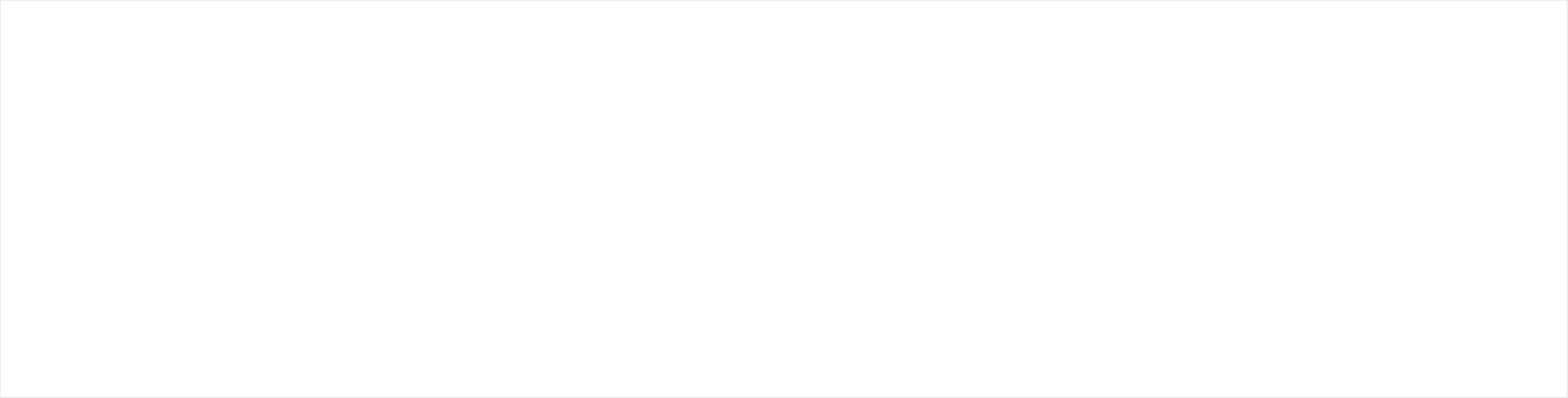
| Category | Gemiddelde van Actueel | Gemiddelde van Gewenst |
|---|---|---|
| 01 Governance | 2.667 | 3 |
| 02 Organisatie | 3 | 4 |
| 03 Risk Management | 2.667 | 5 |
| 04 Personeelsmanagement | 3.143 | 3 |
| 05 Configuration Management | 3 | 4 |
| 06 Incident/Problem Management | 3.5 | 5 |
| 07 Change Management | 2.667 | 3 |
| 08 Systeemontwikkeling | 3 | 4 |
| 09 Data Management | 3.333 | 3 |
| 10 Identity & Access Management | 3 | 4 |
| 11 Security Management | 2.769 | 5 |
| 12 Fysieke beveiliging | 4.5 | 3 |
| 13 IT-operatie | 2 | 4 |
| 14 Bedrijfscontinuïteitsmanagement | 3 | 5 |
| 15 Ketenbeheer | 3.333 | 3 |